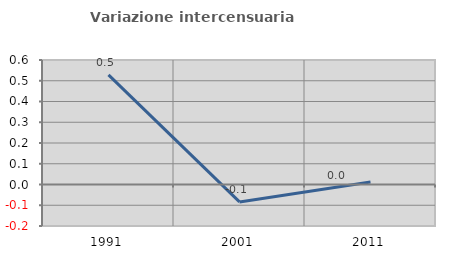
| Category | Variazione intercensuaria annua |
|---|---|
| 1991.0 | 0.528 |
| 2001.0 | -0.084 |
| 2011.0 | 0.012 |